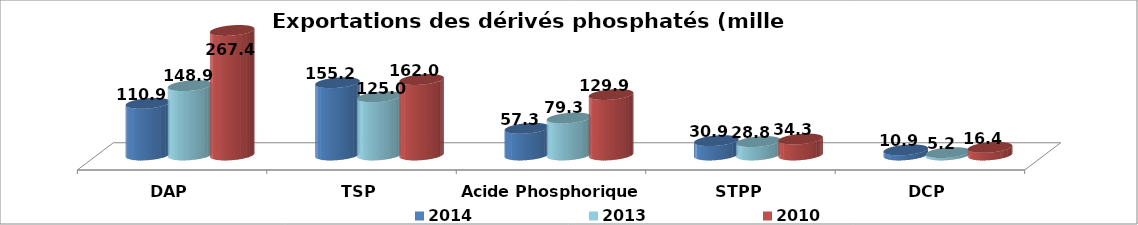
| Category | 2014 | 2013 | 2010 |
|---|---|---|---|
| DAP | 110.905 | 148.85 | 267.353 |
| TSP | 155.23 | 124.96 | 161.99 |
| Acide Phosphorique 54% | 57.251 | 79.347 | 129.873 |
| STPP | 30.852 | 28.767 | 34.262 |
| DCP | 10.9 | 5.2 | 16.375 |